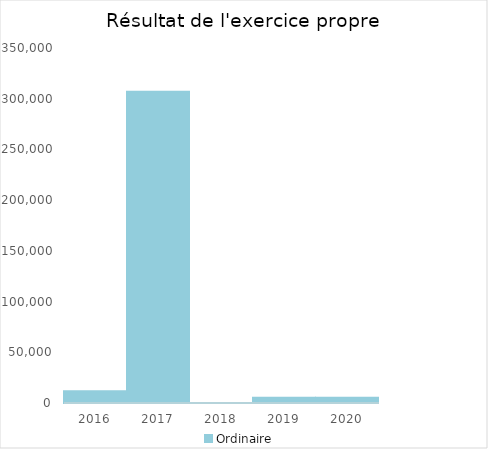
| Category |   | Ordinaire |    |
|---|---|---|---|
| 2016.0 |  | 11576.64 |  |
| 2017.0 |  | 306790.51 |  |
| 2018.0 |  | 68.87 |  |
| 2019.0 |  | 5098.3 |  |
| 2020.0 |  | 5283.37 |  |